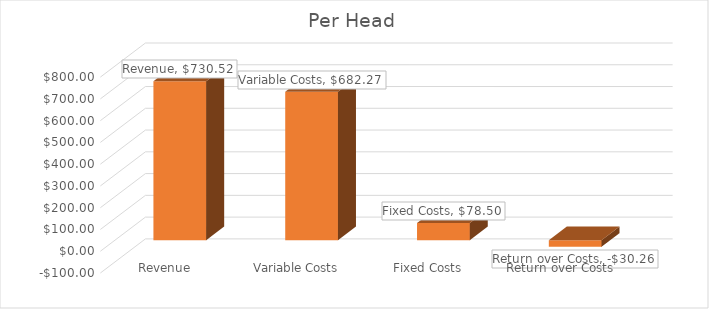
| Category | Per Head |
|---|---|
| Revenue | 730.517 |
| Variable Costs | 682.272 |
| Fixed Costs | 78.5 |
| Return over Costs | -30.255 |